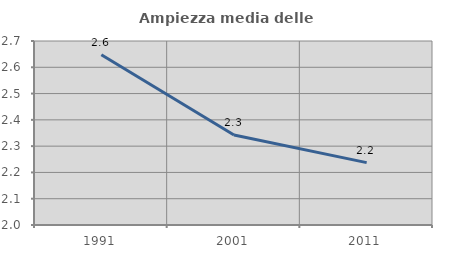
| Category | Ampiezza media delle famiglie |
|---|---|
| 1991.0 | 2.648 |
| 2001.0 | 2.343 |
| 2011.0 | 2.237 |